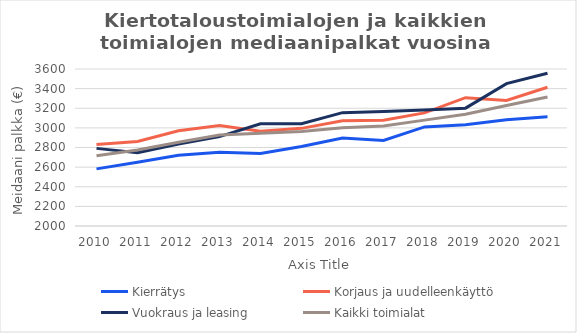
| Category | Kierrätys | Korjaus ja uudelleenkäyttö | Vuokraus ja leasing | Kaikki toimialat |
|---|---|---|---|---|
| 2010.0 | 2582 | 2831 | 2791 | 2715 |
| 2011.0 | 2650 | 2861 | 2746 | 2774 |
| 2012.0 | 2720 | 2971 | 2836 | 2853 |
| 2013.0 | 2751 | 3024 | 2911 | 2928 |
| 2014.0 | 2740 | 2966 | 3042 | 2946 |
| 2015.0 | 2811 | 2995 | 3042 | 2963 |
| 2016.0 | 2896 | 3072 | 3155 | 3001 |
| 2017.0 | 2871 | 3077 | 3167 | 3018 |
| 2018.0 | 3010 | 3153 | 3181 | 3079 |
| 2019.0 | 3033 | 3308 | 3201 | 3139 |
| 2020.0 | 3082 | 3280 | 3451 | 3228 |
| 2021.0 | 3113 | 3414 | 3556 | 3314 |